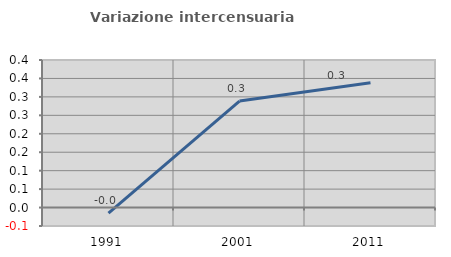
| Category | Variazione intercensuaria annua |
|---|---|
| 1991.0 | -0.015 |
| 2001.0 | 0.289 |
| 2011.0 | 0.339 |